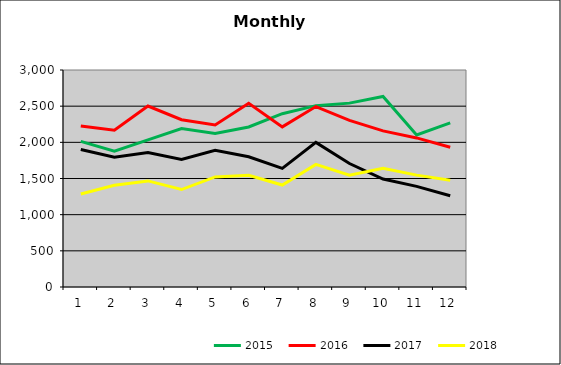
| Category | 2015 | 2016 | 2017 | 2018 |
|---|---|---|---|---|
| 0 | 2012.541 | 2226.188 | 1900.859 | 1286.21 |
| 1 | 1876.319 | 2166.497 | 1795.105 | 1406.556 |
| 2 | 2033.639 | 2501.903 | 1859.386 | 1466.695 |
| 3 | 2190.038 | 2312.349 | 1764.013 | 1347.408 |
| 4 | 2122.18 | 2240.561 | 1891.399 | 1522.181 |
| 5 | 2212.445 | 2540.235 | 1800.236 | 1543.945 |
| 6 | 2396.234 | 2213.485 | 1640.121 | 1409.491 |
| 7 | 2507.021 | 2494.361 | 1999.331 | 1694.901 |
| 8 | 2542.091 | 2304.009 | 1706.874 | 1545.104 |
| 9 | 2633.621 | 2158.544 | 1492.036 | 1642.816 |
| 10 | 2103.155 | 2060.966 | 1390.86 | 1546.582 |
| 11 | 2268.667 | 1932.97 | 1261.902 | 1474.68 |